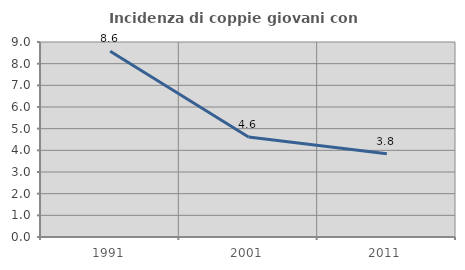
| Category | Incidenza di coppie giovani con figli |
|---|---|
| 1991.0 | 8.571 |
| 2001.0 | 4.615 |
| 2011.0 | 3.846 |